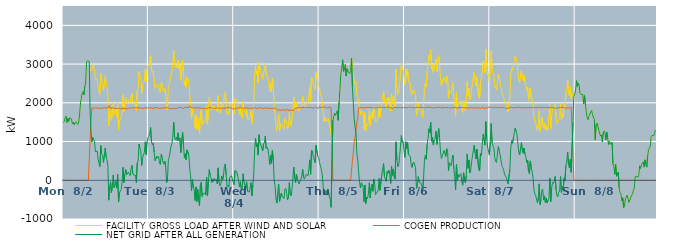
| Category | FACILITY GROSS LOAD AFTER WIND AND SOLAR | COGEN PRODUCTION | NET GRID AFTER ALL GENERATION |
|---|---|---|---|
|  Mon  8/2 | 1484 | 0 | 1484 |
|  Mon  8/2 | 1521 | 0 | 1521 |
|  Mon  8/2 | 1619 | 0 | 1619 |
|  Mon  8/2 | 1658 | 0 | 1658 |
|  Mon  8/2 | 1492 | 0 | 1492 |
|  Mon  8/2 | 1595 | 0 | 1595 |
|  Mon  8/2 | 1520 | 0 | 1520 |
|  Mon  8/2 | 1614 | 0 | 1614 |
|  Mon  8/2 | 1636 | 0 | 1636 |
|  Mon  8/2 | 1587 | 0 | 1587 |
|  Mon  8/2 | 1457 | 0 | 1457 |
|  Mon  8/2 | 1501 | 0 | 1501 |
|  Mon  8/2 | 1428 | 0 | 1428 |
|  Mon  8/2 | 1482 | 0 | 1482 |
|  Mon  8/2 | 1511 | 0 | 1511 |
|  Mon  8/2 | 1494 | 0 | 1494 |
|  Mon  8/2 | 1442 | 0 | 1442 |
|  Mon  8/2 | 1482 | 0 | 1482 |
|  Mon  8/2 | 1652 | 0 | 1652 |
|  Mon  8/2 | 1948 | 0 | 1948 |
|  Mon  8/2 | 2116 | 0 | 2116 |
|  Mon  8/2 | 2245 | 0 | 2245 |
|  Mon  8/2 | 2290 | 0 | 2290 |
|  Mon  8/2 | 2203 | 0 | 2203 |
|  Mon  8/2 | 2421 | 0 | 2421 |
|  Mon  8/2 | 2537 | 0 | 2537 |
|  Mon  8/2 | 3059 | 0 | 3059 |
|  Mon  8/2 | 3088 | 0 | 3088 |
|  Mon  8/2 | 3072 | 0 | 3072 |
|  Mon  8/2 | 3067 | 0 | 3067 |
|  Mon  8/2 | 2804 | 1039 | 1765 |
|  Mon  8/2 | 2814 | 1559 | 1255 |
|  Mon  8/2 | 2858 | 1871 | 987 |
|  Mon  8/2 | 2979 | 1873 | 1106 |
|  Mon  8/2 | 2959 | 1853 | 1106 |
|  Mon  8/2 | 2857 | 1863 | 994 |
|  Mon  8/2 | 2616 | 1879 | 737 |
|  Mon  8/2 | 2593 | 1862 | 731 |
|  Mon  8/2 | 2616 | 1863 | 753 |
|  Mon  8/2 | 2411 | 1871 | 540 |
|  Mon  8/2 | 2311 | 1863 | 448 |
|  Mon  8/2 | 2225 | 1871 | 354 |
|  Mon  8/2 | 2751 | 1857 | 894 |
|  Mon  8/2 | 2568 | 1880 | 688 |
|  Mon  8/2 | 2498 | 1860 | 638 |
|  Mon  8/2 | 2321 | 1858 | 463 |
|  Mon  8/2 | 2526 | 1876 | 650 |
|  Mon  8/2 | 2698 | 1865 | 833 |
|  Mon  8/2 | 2470 | 1864 | 606 |
|  Mon  8/2 | 2390 | 1860 | 530 |
|  Mon  8/2 | 2218 | 1865 | 353 |
|  Mon  8/2 | 1412 | 1927 | -515 |
|  Mon  8/2 | 1710 | 1872 | -162 |
|  Mon  8/2 | 1824 | 1866 | -42 |
|  Mon  8/2 | 1544 | 1864 | -320 |
|  Mon  8/2 | 1716 | 1868 | -152 |
|  Mon  8/2 | 2005 | 1868 | 137 |
|  Mon  8/2 | 1692 | 1881 | -189 |
|  Mon  8/2 | 1731 | 1862 | -131 |
|  Mon  8/2 | 1843 | 1868 | -25 |
|  Mon  8/2 | 1640 | 1843 | -203 |
|  Mon  8/2 | 2010 | 1862 | 148 |
|  Mon  8/2 | 1305 | 1868 | -563 |
|  Mon  8/2 | 1522 | 1851 | -329 |
|  Mon  8/2 | 1577 | 1851 | -274 |
|  Mon  8/2 | 1629 | 1869 | -240 |
|  Mon  8/2 | 1797 | 1837 | -40 |
|  Mon  8/2 | 2207 | 1874 | 333 |
|  Mon  8/2 | 1779 | 1840 | -61 |
|  Mon  8/2 | 2002 | 1855 | 147 |
|  Mon  8/2 | 2144 | 1866 | 278 |
|  Mon  8/2 | 1977 | 1838 | 139 |
|  Mon  8/2 | 2015 | 1863 | 152 |
|  Mon  8/2 | 2072 | 1858 | 214 |
|  Mon  8/2 | 2068 | 1871 | 197 |
|  Mon  8/2 | 1994 | 1873 | 121 |
|  Mon  8/2 | 2166 | 1877 | 289 |
|  Mon  8/2 | 2244 | 1862 | 382 |
|  Mon  8/2 | 2026 | 1856 | 170 |
|  Mon  8/2 | 2011 | 1878 | 133 |
|  Mon  8/2 | 2020 | 1863 | 157 |
|  Mon  8/2 | 2000 | 1871 | 129 |
|  Mon  8/2 | 1799 | 1860 | -61 |
|  Mon  8/2 | 2324 | 1869 | 455 |
|  Mon  8/2 | 2359 | 1864 | 495 |
|  Mon  8/2 | 2809 | 1875 | 934 |
|  Mon  8/2 | 2684 | 1860 | 824 |
|  Mon  8/2 | 2620 | 1863 | 757 |
|  Mon  8/2 | 2250 | 1866 | 384 |
|  Mon  8/2 | 2453 | 1860 | 593 |
|  Mon  8/2 | 2526 | 1878 | 648 |
|  Mon  8/2 | 2588 | 1862 | 726 |
|  Mon  8/2 | 2863 | 1869 | 994 |
|  Mon  8/2 | 2538 | 1875 | 663 |
|  Mon  8/2 | 2869 | 1874 | 995 |
|  Mon  8/2 | 2959 | 1864 | 1095 |
|  Tue  8/3 | 2998 | 1866 | 1132 |
|  Tue  8/3 | 3090 | 1878 | 1212 |
|  Tue  8/3 | 3223 | 1858 | 1365 |
|  Tue  8/3 | 2861 | 1868 | 993 |
|  Tue  8/3 | 2779 | 1866 | 913 |
|  Tue  8/3 | 2810 | 1845 | 965 |
|  Tue  8/3 | 2607 | 1881 | 726 |
|  Tue  8/3 | 2367 | 1860 | 507 |
|  Tue  8/3 | 2367 | 1868 | 499 |
|  Tue  8/3 | 2465 | 1849 | 616 |
|  Tue  8/3 | 2456 | 1876 | 580 |
|  Tue  8/3 | 2465 | 1853 | 612 |
|  Tue  8/3 | 2305 | 1854 | 451 |
|  Tue  8/3 | 2270 | 1862 | 408 |
|  Tue  8/3 | 2538 | 1865 | 673 |
|  Tue  8/3 | 2456 | 1864 | 592 |
|  Tue  8/3 | 2316 | 1862 | 454 |
|  Tue  8/3 | 2290 | 1872 | 418 |
|  Tue  8/3 | 2370 | 1873 | 497 |
|  Tue  8/3 | 2206 | 1864 | 342 |
|  Tue  8/3 | 1813 | 1875 | -62 |
|  Tue  8/3 | 1889 | 1859 | 30 |
|  Tue  8/3 | 2401 | 1868 | 533 |
|  Tue  8/3 | 2465 | 1860 | 605 |
|  Tue  8/3 | 2595 | 1859 | 736 |
|  Tue  8/3 | 2738 | 1852 | 886 |
|  Tue  8/3 | 2790 | 1834 | 956 |
|  Tue  8/3 | 2997 | 1861 | 1136 |
|  Tue  8/3 | 3357 | 1858 | 1499 |
|  Tue  8/3 | 2975 | 1858 | 1117 |
|  Tue  8/3 | 2914 | 1872 | 1042 |
|  Tue  8/3 | 2967 | 1850 | 1117 |
|  Tue  8/3 | 2892 | 1867 | 1025 |
|  Tue  8/3 | 3096 | 1871 | 1225 |
|  Tue  8/3 | 2884 | 1866 | 1018 |
|  Tue  8/3 | 2972 | 1887 | 1085 |
|  Tue  8/3 | 2583 | 1865 | 718 |
|  Tue  8/3 | 2594 | 1863 | 731 |
|  Tue  8/3 | 3108 | 1871 | 1237 |
|  Tue  8/3 | 2776 | 1863 | 913 |
|  Tue  8/3 | 2443 | 1865 | 578 |
|  Tue  8/3 | 2569 | 1885 | 684 |
|  Tue  8/3 | 2406 | 1876 | 530 |
|  Tue  8/3 | 2666 | 1880 | 786 |
|  Tue  8/3 | 2685 | 1877 | 808 |
|  Tue  8/3 | 2529 | 1877 | 652 |
|  Tue  8/3 | 2223 | 1924 | 299 |
|  Tue  8/3 | 1991 | 1880 | 111 |
|  Tue  8/3 | 1590 | 1865 | -275 |
|  Tue  8/3 | 1886 | 1864 | 22 |
|  Tue  8/3 | 1693 | 1866 | -173 |
|  Tue  8/3 | 1629 | 1870 | -241 |
|  Tue  8/3 | 1346 | 1867 | -521 |
|  Tue  8/3 | 1702 | 1874 | -172 |
|  Tue  8/3 | 1314 | 1864 | -550 |
|  Tue  8/3 | 1628 | 1865 | -237 |
|  Tue  8/3 | 1354 | 1871 | -517 |
|  Tue  8/3 | 1208 | 1868 | -660 |
|  Tue  8/3 | 1735 | 1859 | -124 |
|  Tue  8/3 | 1817 | 1866 | -49 |
|  Tue  8/3 | 1437 | 1853 | -416 |
|  Tue  8/3 | 1512 | 1855 | -343 |
|  Tue  8/3 | 1536 | 1866 | -330 |
|  Tue  8/3 | 1515 | 1844 | -329 |
|  Tue  8/3 | 1486 | 1870 | -384 |
|  Tue  8/3 | 1936 | 1857 | 79 |
|  Tue  8/3 | 1440 | 1847 | -407 |
|  Tue  8/3 | 1841 | 1873 | -32 |
|  Tue  8/3 | 2147 | 1871 | 276 |
|  Tue  8/3 | 1999 | 1876 | 123 |
|  Tue  8/3 | 1947 | 1883 | 64 |
|  Tue  8/3 | 1812 | 1868 | -56 |
|  Tue  8/3 | 1920 | 1884 | 36 |
|  Tue  8/3 | 1816 | 1849 | -33 |
|  Tue  8/3 | 1905 | 1860 | 45 |
|  Tue  8/3 | 1849 | 1863 | -14 |
|  Tue  8/3 | 1884 | 1857 | 27 |
|  Tue  8/3 | 1774 | 1869 | -95 |
|  Tue  8/3 | 2189 | 1867 | 322 |
|  Tue  8/3 | 1811 | 1860 | -49 |
|  Tue  8/3 | 1731 | 1877 | -146 |
|  Tue  8/3 | 1754 | 1854 | -100 |
|  Tue  8/3 | 1959 | 1849 | 110 |
|  Tue  8/3 | 1893 | 1879 | 14 |
|  Tue  8/3 | 1984 | 1848 | 136 |
|  Tue  8/3 | 2222 | 1867 | 355 |
|  Tue  8/3 | 2284 | 1863 | 421 |
|  Tue  8/3 | 2001 | 1870 | 131 |
|  Tue  8/3 | 1710 | 1875 | -165 |
|  Tue  8/3 | 1744 | 1876 | -132 |
|  Tue  8/3 | 1691 | 1869 | -178 |
|  Tue  8/3 | 1934 | 1859 | 75 |
|  Tue  8/3 | 1966 | 1873 | 93 |
|  Tue  8/3 | 1980 | 1863 | 117 |
|  Tue  8/3 | 1976 | 1857 | 119 |
|  Tue  8/3 | 1818 | 1874 | -56 |
|  Wed  8/4 | 1715 | 1829 | -114 |
|  Wed  8/4 | 2107 | 1858 | 249 |
|  Wed  8/4 | 2109 | 1857 | 252 |
|  Wed  8/4 | 2079 | 1862 | 217 |
|  Wed  8/4 | 1960 | 1856 | 104 |
|  Wed  8/4 | 1844 | 1864 | -20 |
|  Wed  8/4 | 1704 | 1874 | -170 |
|  Wed  8/4 | 1850 | 1888 | -38 |
|  Wed  8/4 | 1654 | 1868 | -214 |
|  Wed  8/4 | 1605 | 1856 | -251 |
|  Wed  8/4 | 2040 | 1871 | 169 |
|  Wed  8/4 | 1820 | 1869 | -49 |
|  Wed  8/4 | 1792 | 1865 | -73 |
|  Wed  8/4 | 1674 | 1865 | -191 |
|  Wed  8/4 | 1821 | 1861 | -40 |
|  Wed  8/4 | 1580 | 1866 | -286 |
|  Wed  8/4 | 1571 | 1877 | -306 |
|  Wed  8/4 | 1560 | 1864 | -304 |
|  Wed  8/4 | 1581 | 1866 | -285 |
|  Wed  8/4 | 1797 | 1856 | -59 |
|  Wed  8/4 | 1470 | 1870 | -400 |
|  Wed  8/4 | 1733 | 1858 | -125 |
|  Wed  8/4 | 2032 | 1872 | 160 |
|  Wed  8/4 | 2664 | 1878 | 786 |
|  Wed  8/4 | 2954 | 1867 | 1087 |
|  Wed  8/4 | 2725 | 1857 | 868 |
|  Wed  8/4 | 2818 | 1867 | 951 |
|  Wed  8/4 | 2514 | 1863 | 651 |
|  Wed  8/4 | 3045 | 1871 | 1174 |
|  Wed  8/4 | 2851 | 1876 | 975 |
|  Wed  8/4 | 2838 | 1858 | 980 |
|  Wed  8/4 | 2695 | 1856 | 839 |
|  Wed  8/4 | 2610 | 1854 | 756 |
|  Wed  8/4 | 2790 | 1857 | 933 |
|  Wed  8/4 | 2848 | 1875 | 973 |
|  Wed  8/4 | 3008 | 1871 | 1137 |
|  Wed  8/4 | 2694 | 1870 | 824 |
|  Wed  8/4 | 2713 | 1860 | 853 |
|  Wed  8/4 | 2655 | 1851 | 804 |
|  Wed  8/4 | 2492 | 1858 | 634 |
|  Wed  8/4 | 2291 | 1882 | 409 |
|  Wed  8/4 | 2505 | 1857 | 648 |
|  Wed  8/4 | 2282 | 1845 | 437 |
|  Wed  8/4 | 2636 | 1859 | 777 |
|  Wed  8/4 | 2387 | 1867 | 520 |
|  Wed  8/4 | 1852 | 1863 | -11 |
|  Wed  8/4 | 1745 | 1886 | -141 |
|  Wed  8/4 | 1370 | 1859 | -489 |
|  Wed  8/4 | 1271 | 1860 | -589 |
|  Wed  8/4 | 1477 | 1808 | -331 |
|  Wed  8/4 | 1716 | 1815 | -99 |
|  Wed  8/4 | 1276 | 1821 | -545 |
|  Wed  8/4 | 1288 | 1821 | -533 |
|  Wed  8/4 | 1472 | 1807 | -335 |
|  Wed  8/4 | 1399 | 1815 | -416 |
|  Wed  8/4 | 1389 | 1817 | -428 |
|  Wed  8/4 | 1324 | 1803 | -479 |
|  Wed  8/4 | 1592 | 1826 | -234 |
|  Wed  8/4 | 1590 | 1797 | -207 |
|  Wed  8/4 | 1475 | 1810 | -335 |
|  Wed  8/4 | 1338 | 1841 | -503 |
|  Wed  8/4 | 1370 | 1803 | -433 |
|  Wed  8/4 | 1750 | 1809 | -59 |
|  Wed  8/4 | 1450 | 1809 | -359 |
|  Wed  8/4 | 1394 | 1802 | -408 |
|  Wed  8/4 | 1561 | 1809 | -248 |
|  Wed  8/4 | 1552 | 1819 | -267 |
|  Wed  8/4 | 2145 | 1804 | 341 |
|  Wed  8/4 | 1878 | 1819 | 59 |
|  Wed  8/4 | 1795 | 1864 | -69 |
|  Wed  8/4 | 2020 | 1862 | 158 |
|  Wed  8/4 | 1902 | 1869 | 33 |
|  Wed  8/4 | 1918 | 1875 | 43 |
|  Wed  8/4 | 1779 | 1873 | -94 |
|  Wed  8/4 | 1855 | 1879 | -24 |
|  Wed  8/4 | 1892 | 1875 | 17 |
|  Wed  8/4 | 1974 | 1862 | 112 |
|  Wed  8/4 | 2160 | 1875 | 285 |
|  Wed  8/4 | 1953 | 1883 | 70 |
|  Wed  8/4 | 1917 | 1886 | 31 |
|  Wed  8/4 | 1880 | 1873 | 7 |
|  Wed  8/4 | 2028 | 1872 | 156 |
|  Wed  8/4 | 2025 | 1875 | 150 |
|  Wed  8/4 | 1994 | 1880 | 114 |
|  Wed  8/4 | 2172 | 1883 | 289 |
|  Wed  8/4 | 2412 | 1884 | 528 |
|  Wed  8/4 | 2044 | 1890 | 154 |
|  Wed  8/4 | 2658 | 1877 | 781 |
|  Wed  8/4 | 2613 | 1882 | 731 |
|  Wed  8/4 | 2459 | 1861 | 598 |
|  Wed  8/4 | 2473 | 1880 | 593 |
|  Wed  8/4 | 2350 | 1892 | 458 |
|  Wed  8/4 | 2784 | 1883 | 901 |
|  Wed  8/4 | 2775 | 1871 | 904 |
|  Wed  8/4 | 2493 | 1874 | 619 |
|  Wed  8/4 | 2442 | 1855 | 587 |
|  Thu  8/5 | 2362 | 1907 | 455 |
|  Thu  8/5 | 2249 | 1873 | 376 |
|  Thu  8/5 | 2159 | 1876 | 283 |
|  Thu  8/5 | 2037 | 1885 | 152 |
|  Thu  8/5 | 1750 | 1878 | -128 |
|  Thu  8/5 | 1519 | 1895 | -376 |
|  Thu  8/5 | 1624 | 1889 | -265 |
|  Thu  8/5 | 1523 | 1873 | -350 |
|  Thu  8/5 | 1576 | 1851 | -275 |
|  Thu  8/5 | 1530 | 1868 | -338 |
|  Thu  8/5 | 1594 | 1873 | -279 |
|  Thu  8/5 | 1456 | 1884 | -428 |
|  Thu  8/5 | 1419 | 1895 | -476 |
|  Thu  8/5 | 1171 | 1871 | -700 |
|  Thu  8/5 | 1172 | 1872 | -700 |
|  Thu  8/5 | 1553 | 0 | 1553 |
|  Thu  8/5 | 1541 | 0 | 1541 |
|  Thu  8/5 | 1737 | 0 | 1737 |
|  Thu  8/5 | 1675 | 0 | 1675 |
|  Thu  8/5 | 1694 | 0 | 1694 |
|  Thu  8/5 | 1797 | 0 | 1797 |
|  Thu  8/5 | 1549 | 0 | 1549 |
|  Thu  8/5 | 2019 | 0 | 2019 |
|  Thu  8/5 | 2376 | 0 | 2376 |
|  Thu  8/5 | 2754 | 0 | 2754 |
|  Thu  8/5 | 2912 | 0 | 2912 |
|  Thu  8/5 | 3113 | 0 | 3113 |
|  Thu  8/5 | 2813 | 0 | 2813 |
|  Thu  8/5 | 2877 | 0 | 2877 |
|  Thu  8/5 | 2989 | 0 | 2989 |
|  Thu  8/5 | 2690 | 0 | 2690 |
|  Thu  8/5 | 2880 | 0 | 2880 |
|  Thu  8/5 | 2813 | 0 | 2813 |
|  Thu  8/5 | 2791 | 0 | 2791 |
|  Thu  8/5 | 2755 | 0 | 2755 |
|  Thu  8/5 | 2836 | 0 | 2836 |
|  Thu  8/5 | 3149 | 0 | 3149 |
|  Thu  8/5 | 2908 | 513 | 2395 |
|  Thu  8/5 | 2696 | 717 | 1979 |
|  Thu  8/5 | 2583 | 1010 | 1573 |
|  Thu  8/5 | 2485 | 1112 | 1373 |
|  Thu  8/5 | 2532 | 1309 | 1223 |
|  Thu  8/5 | 2202 | 1517 | 685 |
|  Thu  8/5 | 2141 | 1612 | 529 |
|  Thu  8/5 | 2069 | 1866 | 203 |
|  Thu  8/5 | 1827 | 1880 | -53 |
|  Thu  8/5 | 1683 | 1883 | -200 |
|  Thu  8/5 | 1806 | 1870 | -64 |
|  Thu  8/5 | 1773 | 1876 | -103 |
|  Thu  8/5 | 1715 | 1884 | -169 |
|  Thu  8/5 | 1315 | 1867 | -552 |
|  Thu  8/5 | 1745 | 1866 | -121 |
|  Thu  8/5 | 1277 | 1879 | -602 |
|  Thu  8/5 | 1435 | 1875 | -440 |
|  Thu  8/5 | 1408 | 1882 | -474 |
|  Thu  8/5 | 1545 | 1883 | -338 |
|  Thu  8/5 | 1818 | 1884 | -66 |
|  Thu  8/5 | 1417 | 1874 | -457 |
|  Thu  8/5 | 1683 | 1876 | -193 |
|  Thu  8/5 | 1777 | 1878 | -101 |
|  Thu  8/5 | 1590 | 1873 | -283 |
|  Thu  8/5 | 1897 | 1870 | 27 |
|  Thu  8/5 | 1764 | 1868 | -104 |
|  Thu  8/5 | 1502 | 1875 | -373 |
|  Thu  8/5 | 1526 | 1869 | -343 |
|  Thu  8/5 | 1567 | 1892 | -325 |
|  Thu  8/5 | 1622 | 1879 | -257 |
|  Thu  8/5 | 1920 | 1876 | 44 |
|  Thu  8/5 | 1631 | 1889 | -258 |
|  Thu  8/5 | 1606 | 1879 | -273 |
|  Thu  8/5 | 2034 | 1884 | 150 |
|  Thu  8/5 | 2155 | 1867 | 288 |
|  Thu  8/5 | 2304 | 1874 | 430 |
|  Thu  8/5 | 1982 | 1889 | 93 |
|  Thu  8/5 | 1951 | 1874 | 77 |
|  Thu  8/5 | 1858 | 1885 | -27 |
|  Thu  8/5 | 2119 | 1891 | 228 |
|  Thu  8/5 | 2061 | 1882 | 179 |
|  Thu  8/5 | 2147 | 1886 | 261 |
|  Thu  8/5 | 2022 | 1866 | 156 |
|  Thu  8/5 | 1789 | 1871 | -82 |
|  Thu  8/5 | 2235 | 1876 | 359 |
|  Thu  8/5 | 1980 | 1853 | 127 |
|  Thu  8/5 | 2166 | 1878 | 288 |
|  Thu  8/5 | 1964 | 1881 | 83 |
|  Thu  8/5 | 1898 | 1869 | 29 |
|  Thu  8/5 | 2875 | 1881 | 994 |
|  Thu  8/5 | 2387 | 1860 | 527 |
|  Thu  8/5 | 2212 | 1866 | 346 |
|  Thu  8/5 | 2260 | 1865 | 395 |
|  Thu  8/5 | 2480 | 1884 | 596 |
|  Thu  8/5 | 2735 | 1872 | 863 |
|  Thu  8/5 | 3023 | 1870 | 1153 |
|  Thu  8/5 | 2841 | 1871 | 970 |
|  Thu  8/5 | 2879 | 1876 | 1003 |
|  Thu  8/5 | 2635 | 1886 | 749 |
|  Fri  8/6 | 2471 | 1879 | 592 |
|  Fri  8/6 | 2880 | 1884 | 996 |
|  Fri  8/6 | 2689 | 1868 | 821 |
|  Fri  8/6 | 2857 | 1874 | 983 |
|  Fri  8/6 | 2544 | 1884 | 660 |
|  Fri  8/6 | 2530 | 1871 | 659 |
|  Fri  8/6 | 2513 | 1886 | 627 |
|  Fri  8/6 | 2277 | 1868 | 409 |
|  Fri  8/6 | 2203 | 1869 | 334 |
|  Fri  8/6 | 2302 | 1863 | 439 |
|  Fri  8/6 | 2344 | 1876 | 468 |
|  Fri  8/6 | 2346 | 1874 | 472 |
|  Fri  8/6 | 2198 | 1876 | 322 |
|  Fri  8/6 | 1669 | 1877 | -208 |
|  Fri  8/6 | 1733 | 1889 | -156 |
|  Fri  8/6 | 1966 | 1872 | 94 |
|  Fri  8/6 | 1831 | 1876 | -45 |
|  Fri  8/6 | 1821 | 1851 | -30 |
|  Fri  8/6 | 1808 | 1879 | -71 |
|  Fri  8/6 | 1732 | 1877 | -145 |
|  Fri  8/6 | 1625 | 1884 | -259 |
|  Fri  8/6 | 1963 | 1904 | 59 |
|  Fri  8/6 | 2385 | 1867 | 518 |
|  Fri  8/6 | 2504 | 1858 | 646 |
|  Fri  8/6 | 2424 | 1880 | 544 |
|  Fri  8/6 | 2805 | 1878 | 927 |
|  Fri  8/6 | 2968 | 1883 | 1085 |
|  Fri  8/6 | 3219 | 1891 | 1328 |
|  Fri  8/6 | 3117 | 1885 | 1232 |
|  Fri  8/6 | 3370 | 1876 | 1494 |
|  Fri  8/6 | 2883 | 1878 | 1005 |
|  Fri  8/6 | 2993 | 1881 | 1112 |
|  Fri  8/6 | 2774 | 1865 | 909 |
|  Fri  8/6 | 2916 | 1870 | 1046 |
|  Fri  8/6 | 2960 | 1874 | 1086 |
|  Fri  8/6 | 3131 | 1864 | 1267 |
|  Fri  8/6 | 2805 | 1878 | 927 |
|  Fri  8/6 | 3044 | 1884 | 1160 |
|  Fri  8/6 | 3220 | 1885 | 1335 |
|  Fri  8/6 | 2948 | 1870 | 1078 |
|  Fri  8/6 | 2640 | 1885 | 755 |
|  Fri  8/6 | 2437 | 1873 | 564 |
|  Fri  8/6 | 2457 | 1849 | 608 |
|  Fri  8/6 | 2596 | 1894 | 702 |
|  Fri  8/6 | 2664 | 1888 | 776 |
|  Fri  8/6 | 2675 | 1875 | 800 |
|  Fri  8/6 | 2500 | 1886 | 614 |
|  Fri  8/6 | 2691 | 1874 | 817 |
|  Fri  8/6 | 2657 | 1882 | 775 |
|  Fri  8/6 | 2128 | 1879 | 249 |
|  Fri  8/6 | 2339 | 1884 | 455 |
|  Fri  8/6 | 2271 | 1860 | 411 |
|  Fri  8/6 | 2244 | 1868 | 376 |
|  Fri  8/6 | 2416 | 1879 | 537 |
|  Fri  8/6 | 2514 | 1864 | 650 |
|  Fri  8/6 | 2166 | 1869 | 297 |
|  Fri  8/6 | 1982 | 1882 | 100 |
|  Fri  8/6 | 1642 | 1891 | -249 |
|  Fri  8/6 | 2275 | 1859 | 416 |
|  Fri  8/6 | 1873 | 1870 | 3 |
|  Fri  8/6 | 2017 | 1875 | 142 |
|  Fri  8/6 | 1964 | 1875 | 89 |
|  Fri  8/6 | 2028 | 1878 | 150 |
|  Fri  8/6 | 2054 | 1878 | 176 |
|  Fri  8/6 | 1834 | 1879 | -45 |
|  Fri  8/6 | 1755 | 1884 | -129 |
|  Fri  8/6 | 2072 | 1878 | 194 |
|  Fri  8/6 | 2065 | 1870 | 195 |
|  Fri  8/6 | 1797 | 1865 | -68 |
|  Fri  8/6 | 1986 | 1869 | 117 |
|  Fri  8/6 | 2551 | 1876 | 675 |
|  Fri  8/6 | 2171 | 1862 | 309 |
|  Fri  8/6 | 2379 | 1853 | 526 |
|  Fri  8/6 | 2085 | 1890 | 195 |
|  Fri  8/6 | 2139 | 1879 | 260 |
|  Fri  8/6 | 2341 | 1870 | 471 |
|  Fri  8/6 | 2512 | 1878 | 634 |
|  Fri  8/6 | 2658 | 1874 | 784 |
|  Fri  8/6 | 2788 | 1879 | 909 |
|  Fri  8/6 | 2564 | 1864 | 700 |
|  Fri  8/6 | 2433 | 1885 | 548 |
|  Fri  8/6 | 2670 | 1870 | 800 |
|  Fri  8/6 | 2684 | 1887 | 797 |
|  Fri  8/6 | 2158 | 1872 | 286 |
|  Fri  8/6 | 2112 | 1874 | 238 |
|  Fri  8/6 | 2535 | 1849 | 686 |
|  Fri  8/6 | 2518 | 1879 | 639 |
|  Fri  8/6 | 2809 | 1869 | 940 |
|  Fri  8/6 | 3076 | 1891 | 1185 |
|  Fri  8/6 | 3009 | 1845 | 1164 |
|  Fri  8/6 | 2770 | 1863 | 907 |
|  Fri  8/6 | 3389 | 1875 | 1514 |
|  Fri  8/6 | 2950 | 1861 | 1089 |
|  Fri  8/6 | 2717 | 1858 | 859 |
|  Fri  8/6 | 2761 | 1894 | 867 |
|  Fri  8/6 | 2538 | 1888 | 650 |
|  Sat  8/7 | 2863 | 1880 | 983 |
|  Sat  8/7 | 3339 | 1874 | 1465 |
|  Sat  8/7 | 2866 | 1889 | 977 |
|  Sat  8/7 | 2763 | 1871 | 892 |
|  Sat  8/7 | 2711 | 1863 | 848 |
|  Sat  8/7 | 2466 | 1869 | 597 |
|  Sat  8/7 | 2381 | 1892 | 489 |
|  Sat  8/7 | 2336 | 1876 | 460 |
|  Sat  8/7 | 2335 | 1871 | 464 |
|  Sat  8/7 | 2748 | 1879 | 869 |
|  Sat  8/7 | 2650 | 1875 | 775 |
|  Sat  8/7 | 2537 | 1879 | 658 |
|  Sat  8/7 | 2410 | 1877 | 533 |
|  Sat  8/7 | 2259 | 1880 | 379 |
|  Sat  8/7 | 2205 | 1882 | 323 |
|  Sat  8/7 | 2157 | 1883 | 274 |
|  Sat  8/7 | 2030 | 1873 | 157 |
|  Sat  8/7 | 2044 | 1877 | 167 |
|  Sat  8/7 | 1930 | 1855 | 75 |
|  Sat  8/7 | 1920 | 1864 | 56 |
|  Sat  8/7 | 1768 | 1858 | -90 |
|  Sat  8/7 | 1775 | 1875 | -100 |
|  Sat  8/7 | 2139 | 1878 | 261 |
|  Sat  8/7 | 2711 | 1887 | 824 |
|  Sat  8/7 | 2904 | 1884 | 1020 |
|  Sat  8/7 | 2840 | 1885 | 955 |
|  Sat  8/7 | 2960 | 1873 | 1087 |
|  Sat  8/7 | 3093 | 1865 | 1228 |
|  Sat  8/7 | 3213 | 1869 | 1344 |
|  Sat  8/7 | 3157 | 1885 | 1272 |
|  Sat  8/7 | 3067 | 1883 | 1184 |
|  Sat  8/7 | 2833 | 1870 | 963 |
|  Sat  8/7 | 2608 | 1881 | 727 |
|  Sat  8/7 | 2523 | 1867 | 656 |
|  Sat  8/7 | 2693 | 1893 | 800 |
|  Sat  8/7 | 2842 | 1863 | 979 |
|  Sat  8/7 | 2669 | 1888 | 781 |
|  Sat  8/7 | 2571 | 1873 | 698 |
|  Sat  8/7 | 2711 | 1878 | 833 |
|  Sat  8/7 | 2555 | 1876 | 679 |
|  Sat  8/7 | 2471 | 1861 | 610 |
|  Sat  8/7 | 2329 | 1868 | 461 |
|  Sat  8/7 | 2402 | 1879 | 523 |
|  Sat  8/7 | 2109 | 1872 | 237 |
|  Sat  8/7 | 2049 | 1882 | 167 |
|  Sat  8/7 | 2374 | 1875 | 499 |
|  Sat  8/7 | 2217 | 1867 | 350 |
|  Sat  8/7 | 2224 | 1877 | 347 |
|  Sat  8/7 | 1966 | 1875 | 91 |
|  Sat  8/7 | 1658 | 1877 | -219 |
|  Sat  8/7 | 1537 | 1881 | -344 |
|  Sat  8/7 | 1493 | 1878 | -385 |
|  Sat  8/7 | 1481 | 1873 | -392 |
|  Sat  8/7 | 1291 | 1872 | -581 |
|  Sat  8/7 | 1421 | 1888 | -467 |
|  Sat  8/7 | 1796 | 1888 | -92 |
|  Sat  8/7 | 1266 | 1895 | -629 |
|  Sat  8/7 | 1375 | 1882 | -507 |
|  Sat  8/7 | 1636 | 1890 | -254 |
|  Sat  8/7 | 1648 | 1873 | -225 |
|  Sat  8/7 | 1354 | 1862 | -508 |
|  Sat  8/7 | 1474 | 1878 | -404 |
|  Sat  8/7 | 1303 | 1874 | -571 |
|  Sat  8/7 | 1411 | 1879 | -468 |
|  Sat  8/7 | 1278 | 1866 | -588 |
|  Sat  8/7 | 1371 | 1883 | -512 |
|  Sat  8/7 | 1387 | 1855 | -468 |
|  Sat  8/7 | 1950 | 1897 | 53 |
|  Sat  8/7 | 1329 | 1880 | -551 |
|  Sat  8/7 | 1672 | 1877 | -205 |
|  Sat  8/7 | 1815 | 1864 | -49 |
|  Sat  8/7 | 1796 | 1876 | -80 |
|  Sat  8/7 | 1841 | 1878 | -37 |
|  Sat  8/7 | 1963 | 1864 | 99 |
|  Sat  8/7 | 1630 | 1880 | -250 |
|  Sat  8/7 | 1463 | 1862 | -399 |
|  Sat  8/7 | 1445 | 1875 | -430 |
|  Sat  8/7 | 1562 | 1874 | -312 |
|  Sat  8/7 | 1600 | 1876 | -276 |
|  Sat  8/7 | 1970 | 1874 | 96 |
|  Sat  8/7 | 1560 | 1875 | -315 |
|  Sat  8/7 | 1732 | 1888 | -156 |
|  Sat  8/7 | 1619 | 1875 | -256 |
|  Sat  8/7 | 1940 | 1880 | 60 |
|  Sat  8/7 | 1876 | 1884 | -8 |
|  Sat  8/7 | 2239 | 1861 | 378 |
|  Sat  8/7 | 2328 | 1850 | 478 |
|  Sat  8/7 | 2600 | 1870 | 730 |
|  Sat  8/7 | 2270 | 1862 | 408 |
|  Sat  8/7 | 2185 | 1869 | 316 |
|  Sat  8/7 | 2404 | 1866 | 538 |
|  Sat  8/7 | 2095 | 1890 | 205 |
|  Sat  8/7 | 2076 | 1876 | 200 |
|  Sat  8/7 | 2252 | 767 | 1485 |
|  Sat  8/7 | 2171 | 0 | 2171 |
|  Sat  8/7 | 2241 | 0 | 2241 |
|  Sun  8/8 | 2330 | 0 | 2330 |
|  Sun  8/8 | 2575 | 0 | 2575 |
|  Sun  8/8 | 2422 | 0 | 2422 |
|  Sun  8/8 | 2510 | 0 | 2510 |
|  Sun  8/8 | 2446 | 0 | 2446 |
|  Sun  8/8 | 2242 | 0 | 2242 |
|  Sun  8/8 | 2215 | 0 | 2215 |
|  Sun  8/8 | 2225 | 0 | 2225 |
|  Sun  8/8 | 2214 | 0 | 2214 |
|  Sun  8/8 | 1967 | 0 | 1967 |
|  Sun  8/8 | 2187 | 0 | 2187 |
|  Sun  8/8 | 1989 | 0 | 1989 |
|  Sun  8/8 | 1751 | 0 | 1751 |
|  Sun  8/8 | 1616 | 0 | 1616 |
|  Sun  8/8 | 1563 | 0 | 1563 |
|  Sun  8/8 | 1657 | 0 | 1657 |
|  Sun  8/8 | 1673 | 0 | 1673 |
|  Sun  8/8 | 1765 | 0 | 1765 |
|  Sun  8/8 | 1804 | 0 | 1804 |
|  Sun  8/8 | 1690 | 0 | 1690 |
|  Sun  8/8 | 1698 | 0 | 1698 |
|  Sun  8/8 | 1569 | 0 | 1569 |
|  Sun  8/8 | 1044 | 0 | 1044 |
|  Sun  8/8 | 1437 | 0 | 1437 |
|  Sun  8/8 | 1478 | 0 | 1478 |
|  Sun  8/8 | 1396 | 0 | 1396 |
|  Sun  8/8 | 1299 | 0 | 1299 |
|  Sun  8/8 | 1283 | 0 | 1283 |
|  Sun  8/8 | 1141 | 0 | 1141 |
|  Sun  8/8 | 1169 | 0 | 1169 |
|  Sun  8/8 | 989 | 0 | 989 |
|  Sun  8/8 | 1220 | 0 | 1220 |
|  Sun  8/8 | 1275 | 0 | 1275 |
|  Sun  8/8 | 1245 | 0 | 1245 |
|  Sun  8/8 | 1048 | 0 | 1048 |
|  Sun  8/8 | 1243 | 0 | 1243 |
|  Sun  8/8 | 1096 | 0 | 1096 |
|  Sun  8/8 | 919 | 0 | 919 |
|  Sun  8/8 | 1006 | 0 | 1006 |
|  Sun  8/8 | 1005 | 0 | 1005 |
|  Sun  8/8 | 920 | 0 | 920 |
|  Sun  8/8 | 978 | 0 | 978 |
|  Sun  8/8 | 426 | 0 | 426 |
|  Sun  8/8 | 359 | 0 | 359 |
|  Sun  8/8 | 154 | 0 | 154 |
|  Sun  8/8 | 418 | 0 | 418 |
|  Sun  8/8 | 103 | 0 | 103 |
|  Sun  8/8 | 125 | 0 | 125 |
|  Sun  8/8 | 210 | 0 | 210 |
|  Sun  8/8 | -210 | 0 | -210 |
|  Sun  8/8 | -324 | 0 | -324 |
|  Sun  8/8 | -355 | 0 | -355 |
|  Sun  8/8 | -529 | 0 | -529 |
|  Sun  8/8 | -453 | 0 | -453 |
|  Sun  8/8 | -707 | 0 | -707 |
|  Sun  8/8 | -644 | 0 | -644 |
|  Sun  8/8 | -478 | 0 | -478 |
|  Sun  8/8 | -466 | 0 | -466 |
|  Sun  8/8 | -385 | 0 | -385 |
|  Sun  8/8 | -489 | 0 | -489 |
|  Sun  8/8 | -572 | 0 | -572 |
|  Sun  8/8 | -513 | 0 | -513 |
|  Sun  8/8 | -440 | 0 | -440 |
|  Sun  8/8 | -421 | 0 | -421 |
|  Sun  8/8 | -349 | 0 | -349 |
|  Sun  8/8 | -255 | 0 | -255 |
|  Sun  8/8 | -196 | 0 | -196 |
|  Sun  8/8 | 92 | 0 | 92 |
|  Sun  8/8 | 72 | 0 | 72 |
|  Sun  8/8 | 104 | 0 | 104 |
|  Sun  8/8 | 75 | 0 | 75 |
|  Sun  8/8 | 134 | 0 | 134 |
|  Sun  8/8 | 372 | 0 | 372 |
|  Sun  8/8 | 306 | 0 | 306 |
|  Sun  8/8 | 396 | 0 | 396 |
|  Sun  8/8 | 446 | 0 | 446 |
|  Sun  8/8 | 477 | 0 | 477 |
|  Sun  8/8 | 338 | 0 | 338 |
|  Sun  8/8 | 528 | 0 | 528 |
|  Sun  8/8 | 402 | 0 | 402 |
|  Sun  8/8 | 337 | 0 | 337 |
|  Sun  8/8 | 627 | 0 | 627 |
|  Sun  8/8 | 795 | 0 | 795 |
|  Sun  8/8 | 834 | 0 | 834 |
|  Sun  8/8 | 886 | 0 | 886 |
|  Sun  8/8 | 1131 | 0 | 1131 |
|  Sun  8/8 | 1160 | 0 | 1160 |
|  Sun  8/8 | 1162 | 0 | 1162 |
|  Sun  8/8 | 1148 | 0 | 1148 |
|  Sun  8/8 | 1251 | 0 | 1251 |
|  Sun  8/8 | 1300 | 0 | 1300 |
|  Sun  8/8 | 1319 | 0 | 1319 |